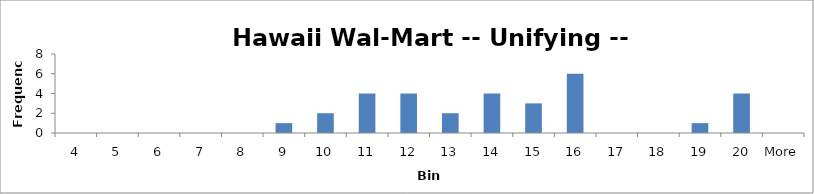
| Category | Frequency |
|---|---|
| 4 | 0 |
| 5 | 0 |
| 6 | 0 |
| 7 | 0 |
| 8 | 0 |
| 9 | 1 |
| 10 | 2 |
| 11 | 4 |
| 12 | 4 |
| 13 | 2 |
| 14 | 4 |
| 15 | 3 |
| 16 | 6 |
| 17 | 0 |
| 18 | 0 |
| 19 | 1 |
| 20 | 4 |
| More | 0 |